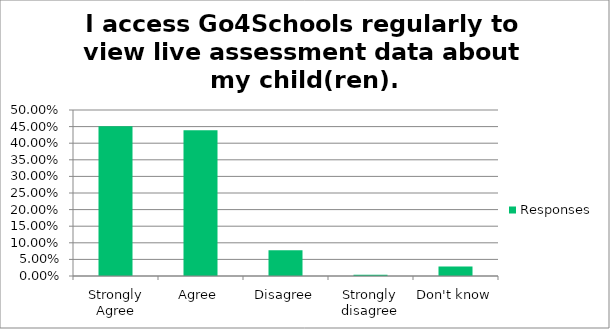
| Category | Responses |
|---|---|
| Strongly Agree | 0.451 |
| Agree | 0.439 |
| Disagree | 0.077 |
| Strongly disagree | 0.004 |
| Don't know | 0.028 |